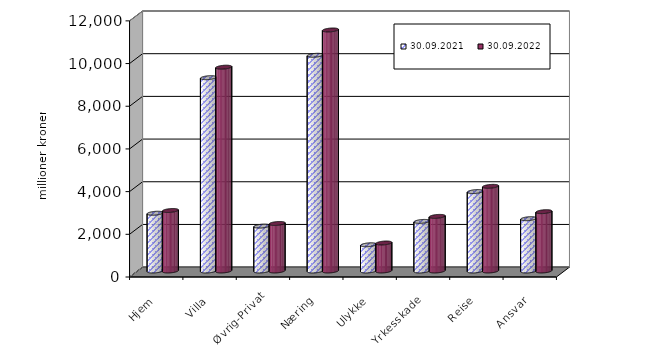
| Category | 30.09.2021 | 30.09.2022 |
|---|---|---|
| Hjem | 2706.305 | 2834.636 |
| Villa | 9058.259 | 9549.025 |
| Øvrig-Privat | 2103.235 | 2227.112 |
| Næring | 10106.597 | 11292.428 |
| Ulykke | 1228.393 | 1311.8 |
| Yrkesskade | 2323.477 | 2558.61 |
| Reise | 3721.378 | 3966.629 |
| Ansvar | 2451.831 | 2779.911 |